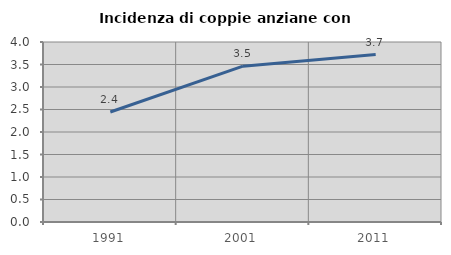
| Category | Incidenza di coppie anziane con figli |
|---|---|
| 1991.0 | 2.444 |
| 2001.0 | 3.463 |
| 2011.0 | 3.72 |